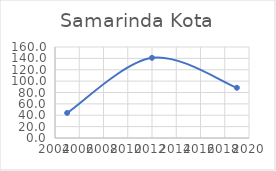
| Category | Series 0 |
|---|---|
| 2005.0 | 44.049 |
| 2012.0 | 140.941 |
| 2019.0 | 88.328 |